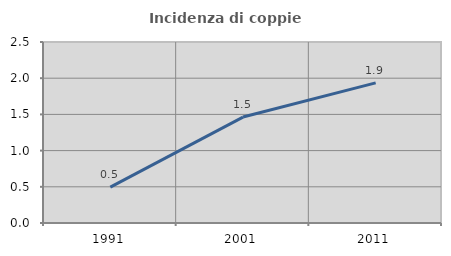
| Category | Incidenza di coppie miste |
|---|---|
| 1991.0 | 0.496 |
| 2001.0 | 1.463 |
| 2011.0 | 1.936 |